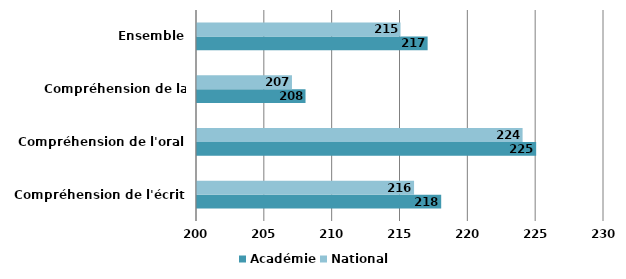
| Category | Académie | National |
|---|---|---|
| Compréhension de l'écrit | 218 | 216 |
| Compréhension de l'oral | 225 | 224 |
| Compréhension de la langue | 208 | 207 |
| Ensemble | 217 | 215 |